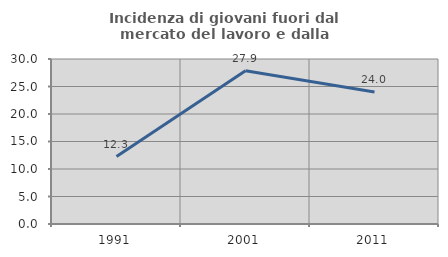
| Category | Incidenza di giovani fuori dal mercato del lavoro e dalla formazione  |
|---|---|
| 1991.0 | 12.263 |
| 2001.0 | 27.866 |
| 2011.0 | 24 |